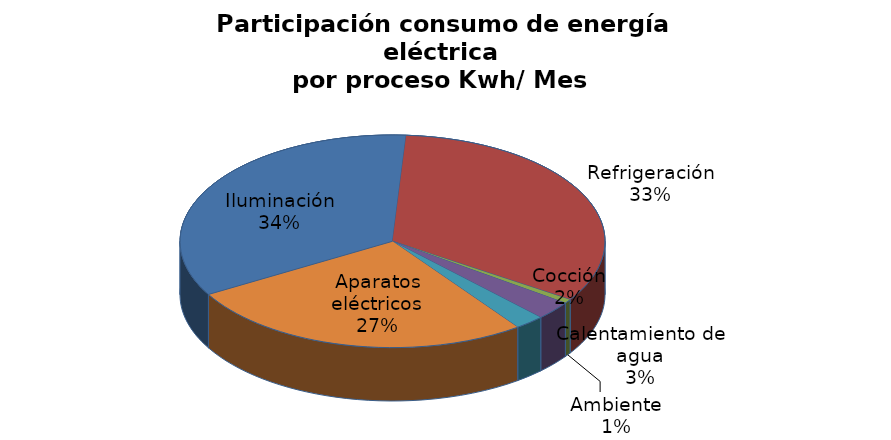
| Category | Series 0 |
|---|---|
| Iluminación | 0.344 |
| Refrigeración | 0.332 |
| Ambiente | 0.006 |
| Calentamiento de agua | 0.028 |
| Cocción | 0.023 |
| Aparatos eléctricos | 0.267 |